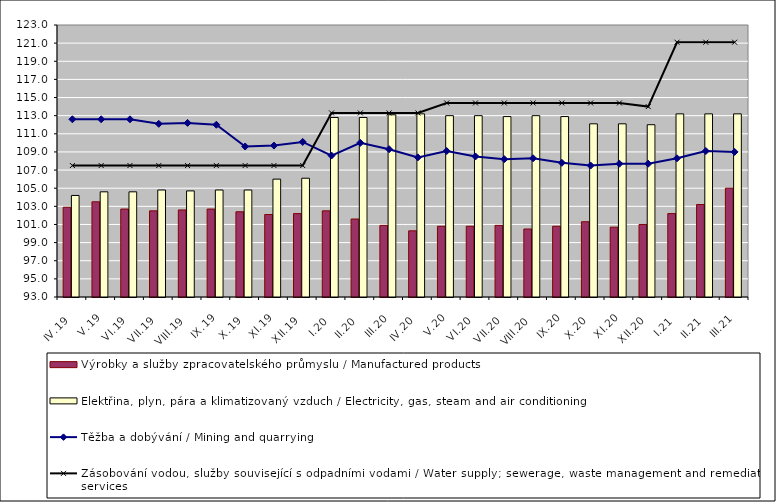
| Category | Výrobky a služby zpracovatelského průmyslu / Manufactured products | Elektřina, plyn, pára a klimatizovaný vzduch / Electricity, gas, steam and air conditioning |
|---|---|---|
| IV.19 | 102.9 | 104.2 |
| V.19 | 103.5 | 104.6 |
| VI.19 | 102.7 | 104.6 |
| VII.19 | 102.5 | 104.8 |
| VIII.19 | 102.6 | 104.7 |
| IX.19 | 102.7 | 104.8 |
| X.19 | 102.4 | 104.8 |
| XI.19 | 102.1 | 106 |
| XII.19 | 102.2 | 106.1 |
| I.20 | 102.5 | 112.8 |
| II.20 | 101.6 | 112.8 |
| III.20 | 100.9 | 113.1 |
| IV.20 | 100.3 | 113.2 |
| V.20 | 100.8 | 113 |
| VI.20 | 100.8 | 113 |
| VII.20 | 100.9 | 112.9 |
| VIII.20 | 100.5 | 113 |
| IX.20 | 100.8 | 112.9 |
| X.20 | 101.3 | 112.1 |
| XI.20 | 100.7 | 112.1 |
| XII.20 | 101 | 112 |
| I.21 | 102.2 | 113.2 |
| II.21 | 103.2 | 113.2 |
| III.21 | 105 | 113.2 |